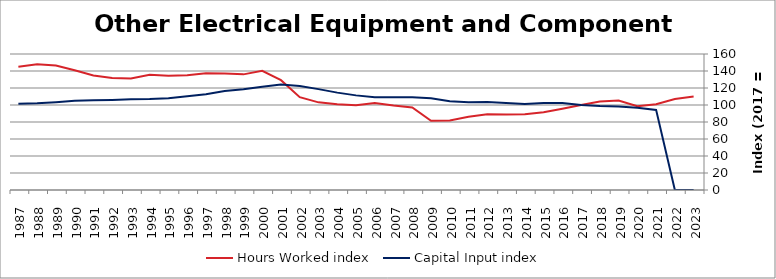
| Category | Hours Worked index | Capital Input index |
|---|---|---|
| 2023.0 | 109.964 | 0 |
| 2022.0 | 106.952 | 0 |
| 2021.0 | 100.943 | 94.256 |
| 2020.0 | 98.516 | 96.752 |
| 2019.0 | 105.237 | 98.202 |
| 2018.0 | 104.12 | 98.738 |
| 2017.0 | 100 | 100 |
| 2016.0 | 95.713 | 102.214 |
| 2015.0 | 91.413 | 102.264 |
| 2014.0 | 89.031 | 101.228 |
| 2013.0 | 88.71 | 102.423 |
| 2012.0 | 89.108 | 103.561 |
| 2011.0 | 86.048 | 103.305 |
| 2010.0 | 81.908 | 104.548 |
| 2009.0 | 81.408 | 108.069 |
| 2008.0 | 97.161 | 109.002 |
| 2007.0 | 99.475 | 109.237 |
| 2006.0 | 102.45 | 109.204 |
| 2005.0 | 99.711 | 111.328 |
| 2004.0 | 100.894 | 114.547 |
| 2003.0 | 103.114 | 118.688 |
| 2002.0 | 109.212 | 122.338 |
| 2001.0 | 129.171 | 124.229 |
| 2000.0 | 140.215 | 121.595 |
| 1999.0 | 136.046 | 118.544 |
| 1998.0 | 136.945 | 116.407 |
| 1997.0 | 137.382 | 112.554 |
| 1996.0 | 134.963 | 110.255 |
| 1995.0 | 134.482 | 108.08 |
| 1994.0 | 135.655 | 106.985 |
| 1993.0 | 131.215 | 106.717 |
| 1992.0 | 131.763 | 106.014 |
| 1991.0 | 134.774 | 105.545 |
| 1990.0 | 140.837 | 104.874 |
| 1989.0 | 146.373 | 103.221 |
| 1988.0 | 147.899 | 102.052 |
| 1987.0 | 145.006 | 101.45 |